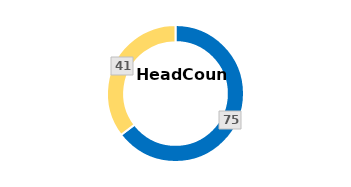
| Category | Total |
|---|---|
| Female | 75 |
| Male | 41 |